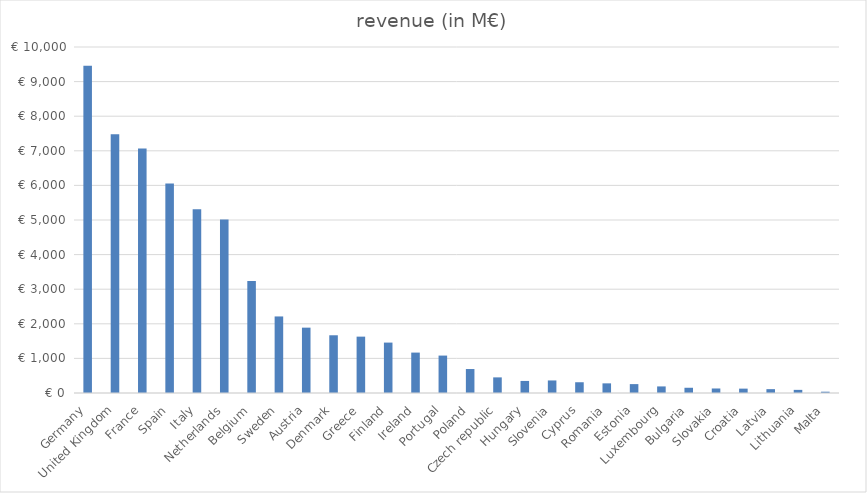
| Category | revenue (in M€) |
|---|---|
| Germany | 9457.461 |
| United Kingdom | 7480.501 |
| France | 7068.186 |
| Spain | 6056.406 |
| Italy | 5309.298 |
| Netherlands | 5016.31 |
| Belgium | 3237.366 |
| Sweden | 2212.556 |
| Austria | 1888.587 |
| Denmark | 1668.5 |
| Greece | 1628.979 |
| Finland | 1456.944 |
| Ireland | 1167.879 |
| Portugal | 1081.554 |
| Poland | 692.79 |
| Czech republic | 451.515 |
| Hungary | 348.39 |
| Slovenia | 362.785 |
| Cyprus | 310.869 |
| Romania | 278.74 |
| Estonia | 256.835 |
| Luxembourg | 190.148 |
| Bulgaria | 151.346 |
| Slovakia | 130.599 |
| Croatia | 126.275 |
| Latvia | 111.508 |
| Lithuania | 90.638 |
| Malta | 37.551 |